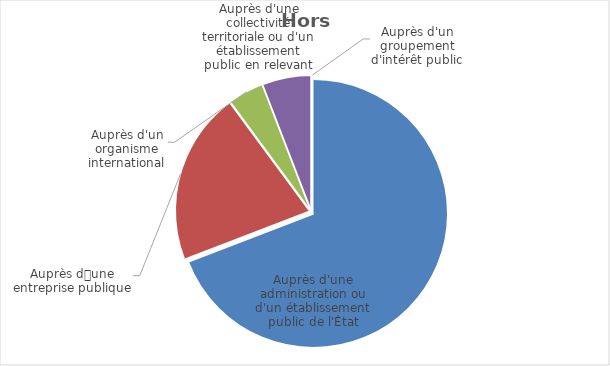
| Category | Hors cadres |
|---|---|
| Auprès d'une administration ou d'un établissement public de l'État | 69.149 |
| Auprès dune entreprise publique | 20.745 |
| Auprès d'un organisme international | 4.255 |
| Auprès d'une collectivité territoriale ou d'un établissement public en relevant | 5.851 |
| Auprès d'un groupement d'intérêt public | 0 |